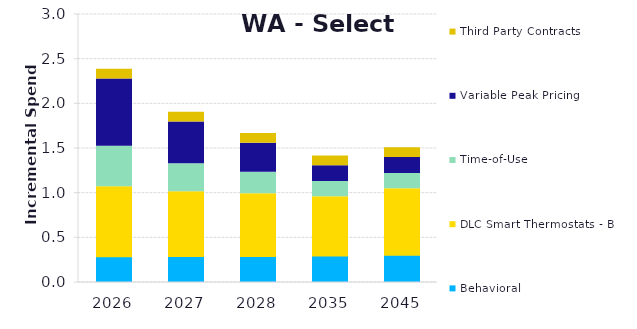
| Category | Behavioral | DLC Smart Thermostats - BYOT | Time-of-Use | Variable Peak Pricing | Third Party Contracts |
|---|---|---|---|---|---|
| 2026.0 | 0.289 | 0.782 | 0.454 | 0.751 | 0.109 |
| 2027.0 | 0.29 | 0.726 | 0.314 | 0.468 | 0.109 |
| 2028.0 | 0.291 | 0.702 | 0.243 | 0.324 | 0.109 |
| 2035.0 | 0.296 | 0.664 | 0.17 | 0.178 | 0.109 |
| 2045.0 | 0.305 | 0.743 | 0.172 | 0.18 | 0.109 |